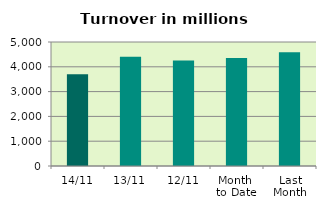
| Category | Series 0 |
|---|---|
| 14/11 | 3697.249 |
| 13/11 | 4401.179 |
| 12/11 | 4249.947 |
| Month 
to Date | 4350.741 |
| Last
Month | 4589.98 |